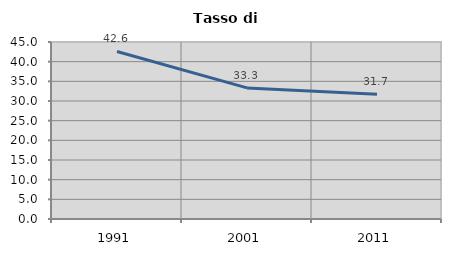
| Category | Tasso di disoccupazione   |
|---|---|
| 1991.0 | 42.6 |
| 2001.0 | 33.333 |
| 2011.0 | 31.74 |